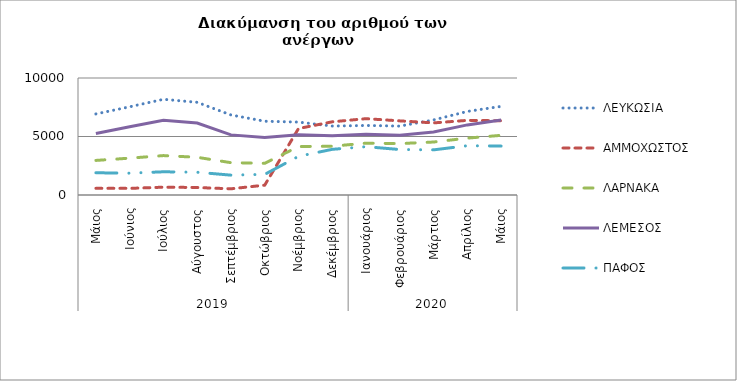
| Category | ΛΕΥΚΩΣΙΑ | ΑΜΜΟΧΩΣΤΟΣ | ΛΑΡΝΑΚΑ | ΛΕΜΕΣΟΣ | ΠΑΦΟΣ |
|---|---|---|---|---|---|
| 0 | 6929 | 570 | 2955 | 5254 | 1899 |
| 1 | 7540 | 567 | 3149 | 5837 | 1867 |
| 2 | 8179 | 668 | 3369 | 6382 | 1984 |
| 3 | 7922 | 641 | 3223 | 6153 | 1944 |
| 4 | 6840 | 529 | 2762 | 5139 | 1697 |
| 5 | 6306 | 843 | 2710 | 4922 | 1763 |
| 6 | 6231 | 5679 | 4139 | 5142 | 3304 |
| 7 | 5893 | 6256 | 4171 | 5061 | 3904 |
| 8 | 5943 | 6524 | 4433 | 5185 | 4129 |
| 9 | 5890 | 6335 | 4394 | 5114 | 3887 |
| 10 | 6416 | 6162 | 4527 | 5390 | 3858 |
| 11 | 7143 | 6380 | 4862 | 5992 | 4214 |
| 12 | 7576 | 6346 | 5099 | 6402 | 4181 |